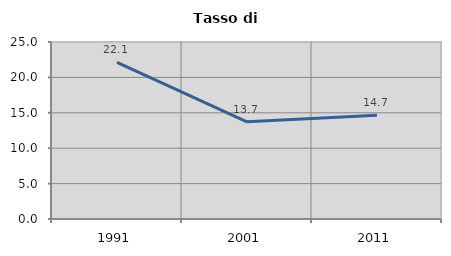
| Category | Tasso di disoccupazione   |
|---|---|
| 1991.0 | 22.124 |
| 2001.0 | 13.727 |
| 2011.0 | 14.652 |